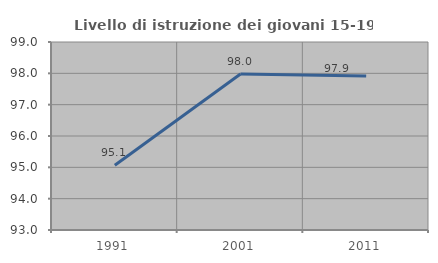
| Category | Livello di istruzione dei giovani 15-19 anni |
|---|---|
| 1991.0 | 95.067 |
| 2001.0 | 97.976 |
| 2011.0 | 97.916 |